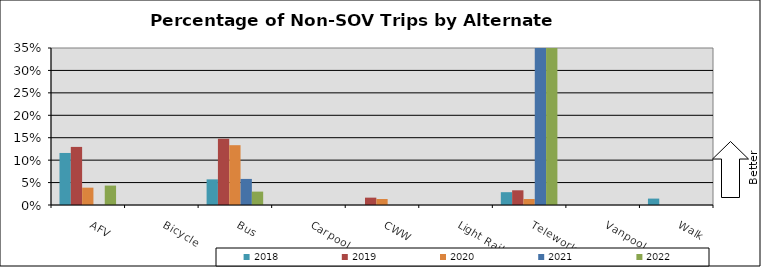
| Category | 2018 | 2019 | 2020 | 2021 | 2022 |
|---|---|---|---|---|---|
| AFV | 0.116 | 0.13 | 0.039 | 0 | 0.043 |
| Bicycle | 0 | 0 | 0 | 0 | 0 |
| Bus | 0.057 | 0.148 | 0.133 | 0.058 | 0.03 |
| Carpool | 0 | 0 | 0 | 0 | 0 |
| CWW | 0 | 0.016 | 0.013 | 0 | 0 |
| Light Rail | 0 | 0 | 0 | 0 | 0 |
| Telework | 0.029 | 0.033 | 0.013 | 0.593 | 0.672 |
| Vanpool | 0 | 0 | 0 | 0 | 0 |
| Walk | 0.014 | 0 | 0 | 0 | 0 |